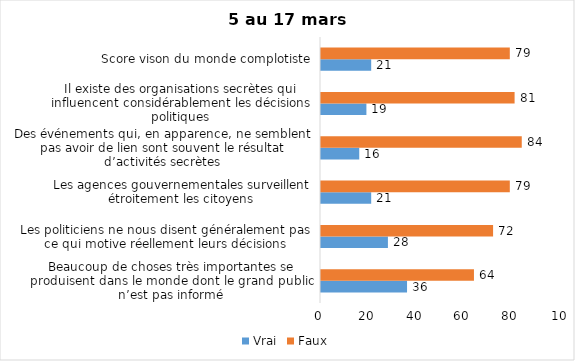
| Category | Vrai | Faux |
|---|---|---|
| Beaucoup de choses très importantes se produisent dans le monde dont le grand public n’est pas informé | 36 | 64 |
| Les politiciens ne nous disent généralement pas ce qui motive réellement leurs décisions | 28 | 72 |
| Les agences gouvernementales surveillent étroitement les citoyens | 21 | 79 |
| Des événements qui, en apparence, ne semblent pas avoir de lien sont souvent le résultat d’activités secrètes | 16 | 84 |
| Il existe des organisations secrètes qui influencent considérablement les décisions politiques | 19 | 81 |
| Score vison du monde complotiste | 21 | 79 |